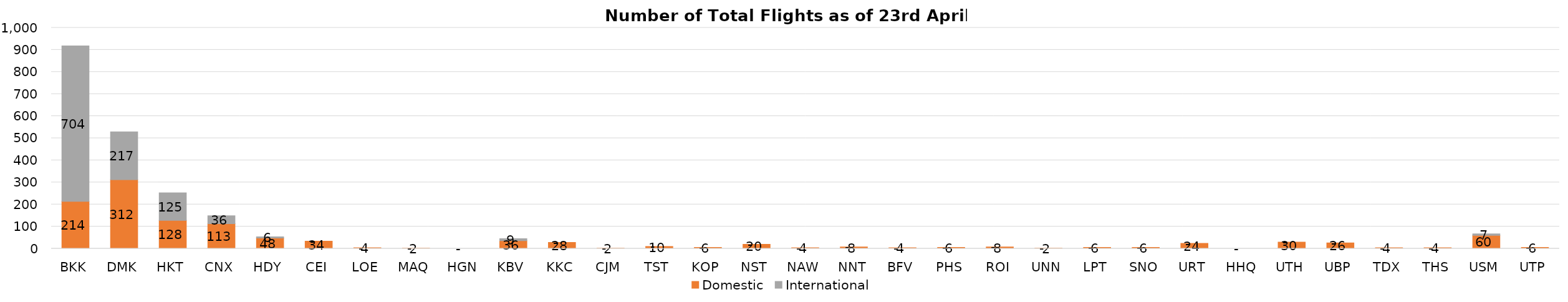
| Category | Domestic | International |
|---|---|---|
| BKK | 214 | 704 |
| DMK | 312 | 217 |
| HKT | 128 | 125 |
| CNX | 113 | 36 |
| HDY | 48 | 6 |
| CEI | 34 | 0 |
| LOE | 4 | 0 |
| MAQ | 2 | 0 |
| HGN | 0 | 0 |
| KBV | 36 | 9 |
| KKC | 28 | 0 |
| CJM | 2 | 0 |
| TST | 10 | 0 |
| KOP | 6 | 0 |
| NST | 20 | 0 |
| NAW | 4 | 0 |
| NNT | 8 | 0 |
| BFV | 4 | 0 |
| PHS | 6 | 0 |
| ROI | 8 | 0 |
| UNN | 2 | 0 |
| LPT | 6 | 0 |
| SNO | 6 | 0 |
| URT | 24 | 0 |
| HHQ | 0 | 0 |
| UTH | 30 | 0 |
| UBP | 26 | 0 |
| TDX | 4 | 0 |
| THS | 4 | 0 |
| USM | 60 | 7 |
| UTP | 6 | 0 |